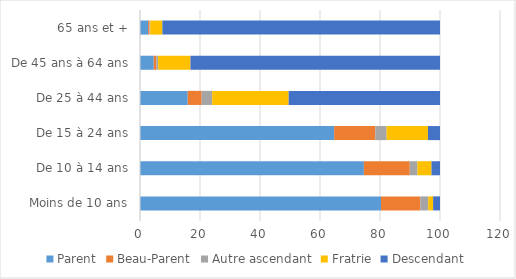
| Category | Parent | Beau-Parent | Autre ascendant | Fratrie | Descendant |
|---|---|---|---|---|---|
| Moins de 10 ans | 80.334 | 13.112 | 2.625 | 1.631 | 2.297 |
| De 10 à 14 ans | 74.628 | 15.298 | 2.543 | 4.69 | 2.841 |
| De 15 à 24 ans | 64.724 | 13.687 | 3.8 | 13.774 | 4.016 |
| De 25 à 44 ans | 15.916 | 4.645 | 3.493 | 25.495 | 50.45 |
| De 45 ans à 64 ans | 4.586 | 0.838 | 0.617 | 10.78 | 83.179 |
| 65 ans et + | 2.694 | 0.449 | 0.269 | 4.041 | 92.546 |